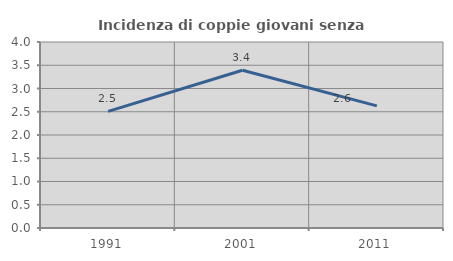
| Category | Incidenza di coppie giovani senza figli |
|---|---|
| 1991.0 | 2.509 |
| 2001.0 | 3.392 |
| 2011.0 | 2.626 |